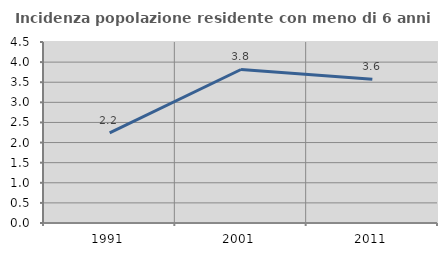
| Category | Incidenza popolazione residente con meno di 6 anni |
|---|---|
| 1991.0 | 2.239 |
| 2001.0 | 3.817 |
| 2011.0 | 3.571 |